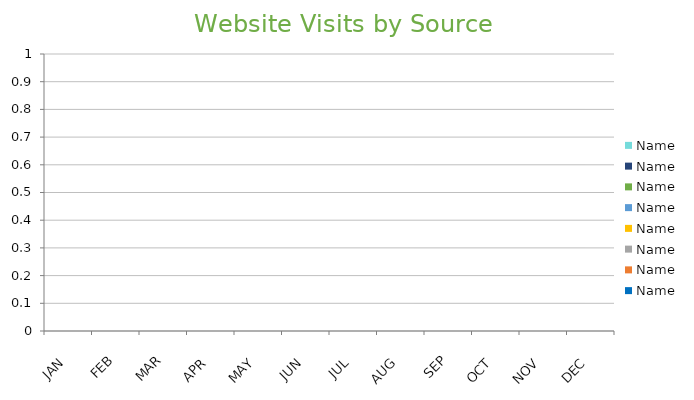
| Category | Name |
|---|---|
| JAN |  |
| FEB |  |
| MAR |  |
| APR |  |
| MAY |  |
| JUN |  |
| JUL |  |
| AUG |  |
| SEP |  |
| OCT |  |
| NOV |  |
| DEC |  |